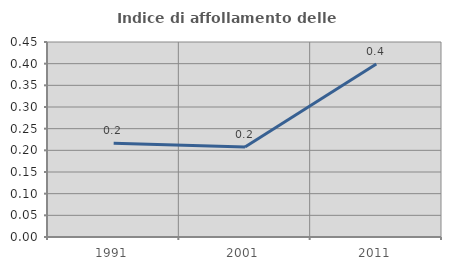
| Category | Indice di affollamento delle abitazioni  |
|---|---|
| 1991.0 | 0.216 |
| 2001.0 | 0.207 |
| 2011.0 | 0.399 |